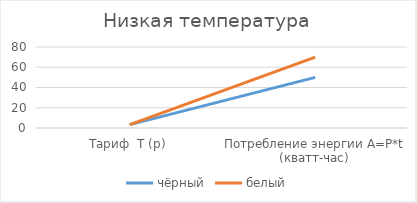
| Category | чёрный | белый |
|---|---|---|
| Тариф  Т (р) | 3.3 | 3.3 |
| Потребление энергии A=P*t (кватт-час) | 50 | 70 |